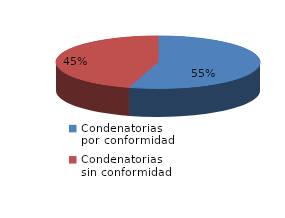
| Category | Series 0 |
|---|---|
| 0 | 24 |
| 1 | 20 |